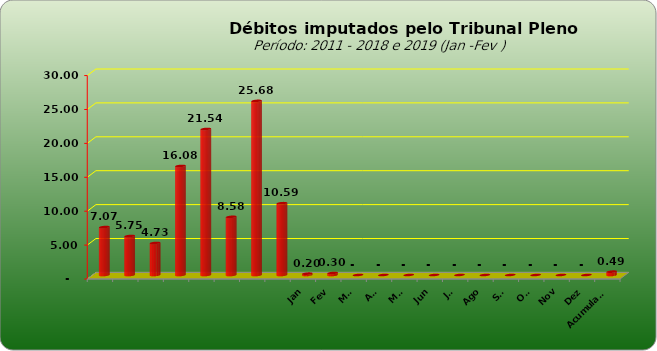
| Category |  7.073.154,74  |
|---|---|
|  | 7073154.74 |
|  | 5749129.25 |
|  | 4727033.51 |
|  | 16081820.48 |
|  | 21535723.6 |
|  | 8578266.09 |
|  | 25676499.17 |
|  | 10590282.73 |
| Jan | 197255.77 |
| Fev | 296375.09 |
| Mar | 0 |
| Abr | 0 |
| Mai | 0 |
| Jun | 0 |
| Jul | 0 |
| Ago | 0 |
| Set | 0 |
| Out | 0 |
| Nov | 0 |
| Dez | 0 |
| Acumulado | 493630.86 |